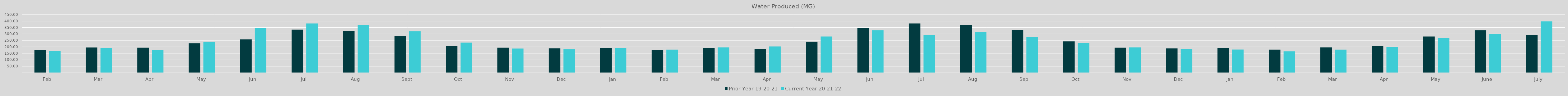
| Category | Prior Year 19-20-21 | Current Year 20-21-22 |
|---|---|---|
| Feb | 173.847 | 167.532 |
| Mar | 195.333 | 190.306 |
| Apr | 193.551 | 178.22 |
| May | 228.091 | 240.625 |
| Jun | 257.9 | 348.57 |
| Jul | 333.37 | 381.34 |
| Aug | 323.49 | 370.12 |
| Sep | 282.53 | 320.39 |
| Oct | 208.72 | 233.34 |
| Nov | 193.92 | 187.14 |
| Dec | 188.86 | 182.02 |
| Jan | 189.94 | 189.96 |
| Feb | 173.75 | 178.97 |
| Mar | 190.77 | 195.96 |
| Apr | 184.23 | 203.05 |
| May | 240.63 | 280.19 |
| Jun | 348.57 | 329.038 |
| Jul | 381.336 | 293.585 |
| Aug | 370.12 | 314.51 |
| Sep | 331.274 | 279.105 |
| Oct | 242.62 | 230.88 |
| Nov | 193.57 | 196.185 |
| Dec | 188.584 | 182.826 |
| Jan | 189.967 | 179.43 |
| Feb | 178.97 | 165.72 |
| Mar | 195.963 | 178.569 |
| Apr | 209.272 | 197.981 |
| May | 280.192 | 268.985 |
| June | 329.04 | 300.92 |
| July | 293.59 | 397.41 |